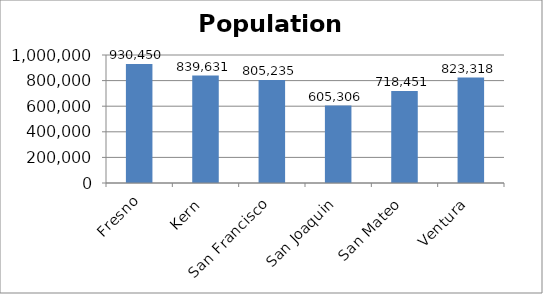
| Category | Series 0 |
|---|---|
| Fresno | 930450 |
| Kern | 839631 |
| San Francisco | 805235 |
| San Joaquin | 605306 |
| San Mateo | 718451 |
| Ventura | 823318 |